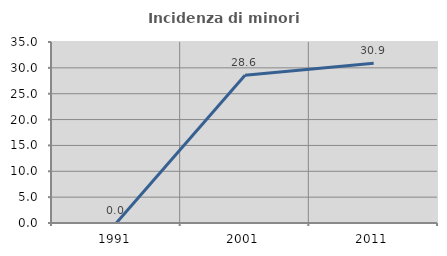
| Category | Incidenza di minori stranieri |
|---|---|
| 1991.0 | 0 |
| 2001.0 | 28.571 |
| 2011.0 | 30.882 |